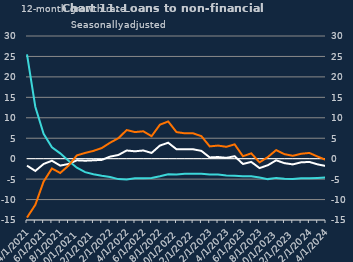
| Category | zero | Non-financial businesses | SMEs |
|---|---|---|---|
| Apr-2021 |  | -1.7 | 25.5 |
| May-2021 |  | -3 | 12.7 |
| Jun-2021 |  | -1.3 | 6.1 |
| Jul-2021 |  | -0.5 | 2.8 |
| Aug-2021 |  | -1.7 | 1.3 |
| Sep-2021 |  | -1.3 | -0.5 |
| Oct-2021 |  | -0.4 | -2.2 |
| Nov-2021 |  | -0.5 | -3.3 |
| Dec-2021 |  | -0.4 | -3.8 |
| Jan-2022 |  | -0.3 | -4.2 |
| Feb-2022 |  | 0.5 | -4.5 |
| Mar-2022 |  | 0.9 | -5 |
| Apr-2022 |  | 2 | -5.1 |
| May-2022 |  | 1.8 | -4.8 |
| Jun-2022 |  | 2 | -4.8 |
| Jul-2022 |  | 1.4 | -4.7 |
| Aug-2022 |  | 3.2 | -4.3 |
| Sep-2022 |  | 3.9 | -3.8 |
| Oct-2022 |  | 2.3 | -3.9 |
| Nov-2022 |  | 2.3 | -3.7 |
| Dec-2022 |  | 2.3 | -3.7 |
| Jan-2023 |  | 1.9 | -3.7 |
| Feb-2023 |  | 0.3 | -3.9 |
| Mar-2023 |  | 0.4 | -3.9 |
| Apr-2023 |  | 0.2 | -4.1 |
| May-2023 |  | 0.6 | -4.2 |
| Jun-2023 |  | -1.3 | -4.3 |
| Jul-2023 |  | -0.8 | -4.3 |
| Aug-2023 |  | -2.3 | -4.6 |
| Sep-2023 |  | -1.6 | -5 |
| Oct-2023 |  | -0.4 | -4.7 |
| Nov-2023 |  | -1.1 | -4.9 |
| Dec-2023 |  | -1.4 | -5 |
| Jan-2024 |  | -0.9 | -4.8 |
| Feb-2024 |  | -0.8 | -4.8 |
| Mar-2024 |  | -1.4 | -4.7 |
| Apr-2024 |  | -1.8 | -4.6 |